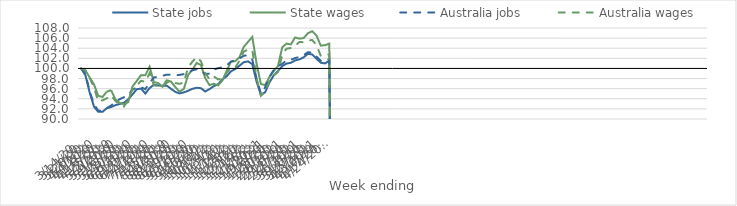
| Category | State jobs | State wages | Australia jobs | Australia wages |
|---|---|---|---|---|
| 14/03/2020 | 100 | 100 | 100 | 100 |
| 21/03/2020 | 98.646 | 99.615 | 98.971 | 99.607 |
| 28/03/2020 | 95.232 | 98.193 | 95.468 | 98.119 |
| 04/04/2020 | 92.459 | 96.855 | 92.921 | 96.261 |
| 11/04/2020 | 91.412 | 94.582 | 91.648 | 93.491 |
| 18/04/2020 | 91.415 | 94.37 | 91.631 | 93.695 |
| 25/04/2020 | 92.14 | 95.412 | 92.161 | 94.112 |
| 02/05/2020 | 92.362 | 95.703 | 92.658 | 94.685 |
| 09/05/2020 | 92.731 | 93.879 | 93.342 | 93.574 |
| 16/05/2020 | 92.971 | 93.18 | 93.935 | 92.809 |
| 23/05/2020 | 93.226 | 92.928 | 94.29 | 92.465 |
| 30/05/2020 | 93.892 | 93.324 | 94.796 | 93.818 |
| 06/06/2020 | 94.857 | 96.432 | 95.779 | 95.924 |
| 13/06/2020 | 95.889 | 97.537 | 96.278 | 96.597 |
| 20/06/2020 | 96.022 | 98.679 | 96.293 | 97.571 |
| 27/06/2020 | 95.034 | 98.658 | 95.898 | 97.324 |
| 04/07/2020 | 96.122 | 100.344 | 97.132 | 99.089 |
| 11/07/2020 | 96.777 | 97.285 | 98.221 | 96.668 |
| 18/07/2020 | 96.644 | 97.126 | 98.324 | 96.5 |
| 25/07/2020 | 96.552 | 96.375 | 98.548 | 96.312 |
| 01/08/2020 | 96.6 | 97.669 | 98.77 | 97.181 |
| 08/08/2020 | 95.983 | 97.409 | 98.766 | 97.601 |
| 15/08/2020 | 95.368 | 96.318 | 98.672 | 97.108 |
| 22/08/2020 | 95.06 | 95.404 | 98.73 | 96.964 |
| 29/08/2020 | 95.27 | 95.968 | 98.866 | 97.198 |
| 05/09/2020 | 95.58 | 98.713 | 99.166 | 100.215 |
| 12/09/2020 | 95.976 | 99.736 | 99.638 | 101.349 |
| 19/09/2020 | 96.17 | 101.078 | 99.835 | 102.253 |
| 26/09/2020 | 96.097 | 100.685 | 99.64 | 101.42 |
| 03/10/2020 | 95.442 | 98.072 | 98.855 | 99.138 |
| 10/10/2020 | 95.915 | 96.713 | 98.997 | 97.834 |
| 17/10/2020 | 96.491 | 96.965 | 99.767 | 98.431 |
| 24/10/2020 | 96.864 | 96.657 | 100.05 | 97.835 |
| 31/10/2020 | 97.829 | 97.579 | 100.228 | 97.89 |
| 07/11/2020 | 98.444 | 99.501 | 100.597 | 99.112 |
| 14/11/2020 | 99.417 | 101.334 | 101.334 | 100.12 |
| 21/11/2020 | 99.882 | 101.429 | 101.652 | 100.166 |
| 28/11/2020 | 100.539 | 102.218 | 101.968 | 101.522 |
| 05/12/2020 | 101.226 | 104.262 | 102.515 | 103.324 |
| 12/12/2020 | 101.397 | 105.264 | 102.583 | 103.755 |
| 19/12/2020 | 100.846 | 106.232 | 101.771 | 103.629 |
| 26/12/2020 | 97.405 | 100.966 | 97.972 | 98.159 |
| 02/01/2021 | 94.82 | 96.949 | 95.021 | 94.58 |
| 09/01/2021 | 95.281 | 96.695 | 96.246 | 95.443 |
| 16/01/2021 | 97.218 | 98.304 | 98.354 | 97.531 |
| 23/01/2021 | 98.626 | 99.463 | 99.666 | 98.597 |
| 30/01/2021 | 99.5 | 100.459 | 100.48 | 99.293 |
| 06/02/2021 | 100.459 | 104.193 | 100.907 | 102.696 |
| 13/02/2021 | 100.961 | 104.915 | 101.592 | 103.915 |
| 20/02/2021 | 101.116 | 104.748 | 101.718 | 104.04 |
| 27/02/2021 | 101.576 | 106.122 | 102.048 | 104.48 |
| 06/03/2021 | 101.787 | 105.892 | 102.273 | 105.217 |
| 13/03/2021 | 102.212 | 106.005 | 102.625 | 105.198 |
| 20/03/2021 | 102.876 | 106.973 | 103.203 | 105.516 |
| 27/03/2021 | 102.763 | 107.363 | 103.136 | 105.634 |
| 03/04/2021 | 101.922 | 106.512 | 102.34 | 104.641 |
| 10/04/2021 | 101.14 | 104.519 | 101.508 | 102.484 |
| 17/04/2021 | 100.996 | 104.599 | 101.424 | 102.692 |
| 24/04/2021 | 101.543 | 104.911 | 101.89 | 102.787 |